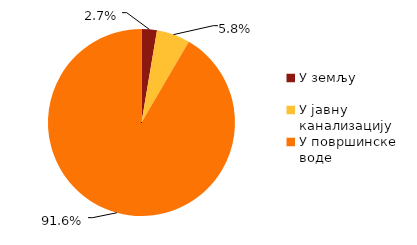
| Category | 2011 |
|---|---|
| У земљу | 574 |
| У јавну канализацију  | 1250 |
| У површинске воде | 19771 |